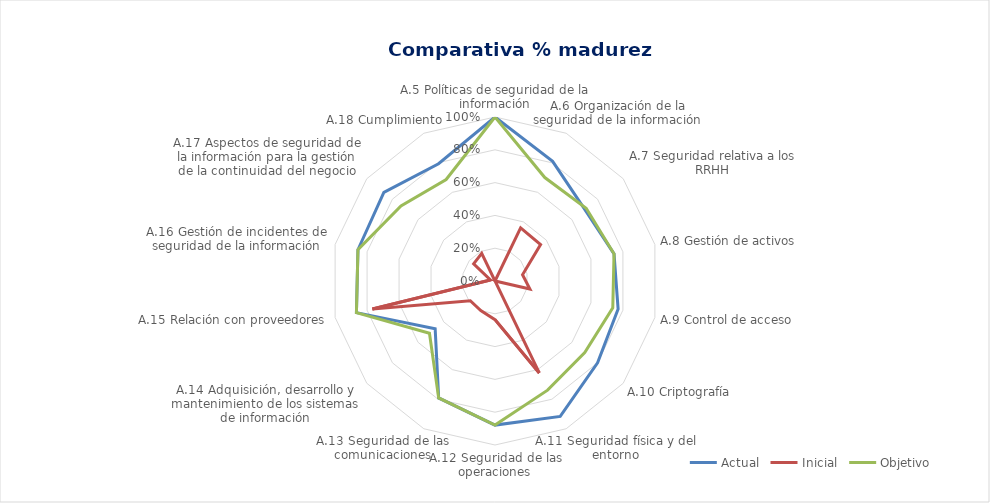
| Category | Actual | Inicial | Objetivo |
|---|---|---|---|
| A.5 Políticas de seguridad de la información | 1 | 0 | 1 |
| A.6 Organización de la seguridad de la información | 0.81 | 0.36 | 0.7 |
| A.7 Seguridad relativa a los RRHH | 0.7 | 0.356 | 0.711 |
| A.8 Gestión de activos | 0.744 | 0.172 | 0.744 |
| A.9 Control de acceso | 0.77 | 0.218 | 0.737 |
| A.10 Criptografía | 0.8 | 0 | 0.7 |
| A.11 Seguridad física y del entorno | 0.917 | 0.622 | 0.739 |
| A.12 Seguridad de las operaciones | 0.879 | 0.236 | 0.879 |
| A.13 Seguridad de las comunicaciones | 0.792 | 0.2 | 0.792 |
| A.14 Adquisición, desarrollo y mantenimiento de los sistemas de información | 0.467 | 0.193 | 0.511 |
| A.15 Relación con proveedores | 0.867 | 0.767 | 0.867 |
| A.16 Gestión de incidentes de seguridad de la información | 0.857 | 0.029 | 0.857 |
| A.17 Aspectos de seguridad de la información para la gestión de la continuidad del negocio | 0.867 | 0.167 | 0.733 |
| A.18 Cumplimiento | 0.793 | 0.187 | 0.687 |